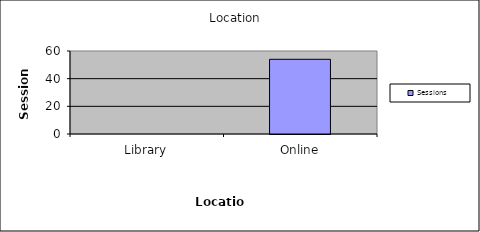
| Category | Sessions |
|---|---|
| Library | 0 |
| Online | 54 |